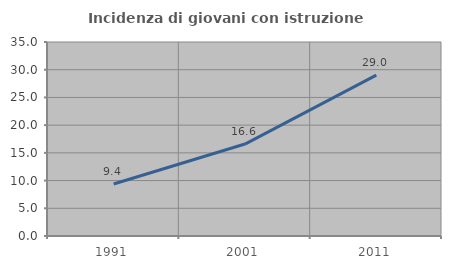
| Category | Incidenza di giovani con istruzione universitaria |
|---|---|
| 1991.0 | 9.39 |
| 2001.0 | 16.588 |
| 2011.0 | 29.032 |